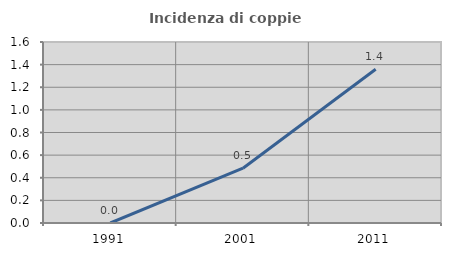
| Category | Incidenza di coppie miste |
|---|---|
| 1991.0 | 0 |
| 2001.0 | 0.485 |
| 2011.0 | 1.359 |